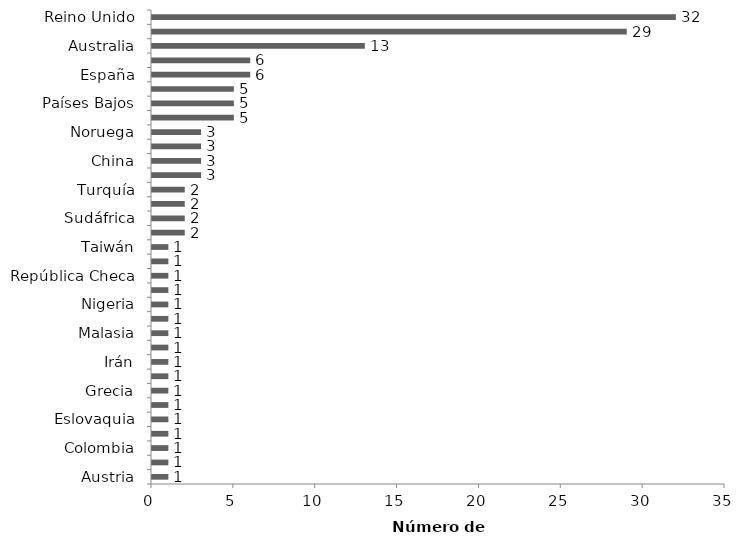
| Category | Series 0 |
|---|---|
| Austria | 1 |
| Brasil | 1 |
| Colombia | 1 |
| Dinamarca | 1 |
| Eslovaquia | 1 |
| Finlandia | 1 |
| Grecia | 1 |
| Indonesia | 1 |
| Irán | 1 |
| Israel | 1 |
| Malasia | 1 |
| México | 1 |
| Nigeria | 1 |
| Nueva Zelanda | 1 |
| República Checa | 1 |
| Tailandia | 1 |
| Taiwán | 1 |
| Gales | 2 |
| Sudáfrica | 2 |
| Suiza | 2 |
| Turquía | 2 |
| Alemania | 3 |
| China | 3 |
| Francia | 3 |
| Noruega | 3 |
| Canadá | 5 |
| Países Bajos | 5 |
| Suecia | 5 |
| España | 6 |
| Italia | 6 |
| Australia | 13 |
| EE.UU. | 29 |
| Reino Unido | 32 |